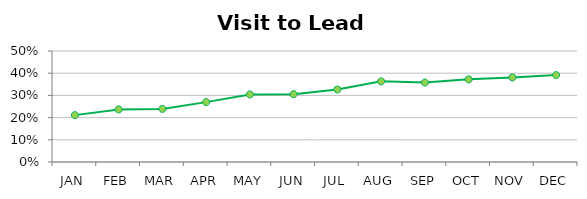
| Category | Visit to Lead % |
|---|---|
| JAN | 0.211 |
| FEB | 0.237 |
| MAR | 0.239 |
| APR | 0.27 |
| MAY | 0.304 |
| JUN | 0.306 |
| JUL | 0.327 |
| AUG | 0.363 |
| SEP | 0.358 |
| OCT | 0.372 |
| NOV | 0.381 |
| DEC | 0.391 |